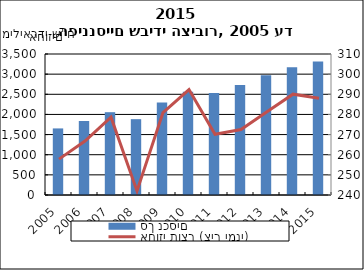
| Category | סך נכסים |
|---|---|
| 2005-12-31 | 1652.614 |
| 2006-12-31 | 1836.569 |
| 2007-12-31 | 2055.36 |
| 2008-12-31 | 1882.478 |
| 2009-12-31 | 2298.206 |
| 2010-12-31 | 2561.081 |
| 2011-12-31 | 2530.109 |
| 2012-12-31 | 2727.912 |
| 2013-12-31 | 2970.651 |
| 2014-12-31 | 3172.323 |
| 2015-12-31 | 3314.765 |